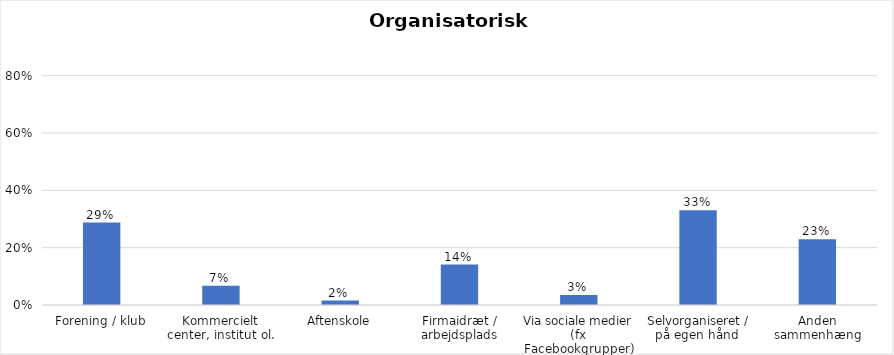
| Category | % |
|---|---|
| Forening / klub | 0.288 |
| Kommercielt center, institut ol. | 0.068 |
| Aftenskole | 0.015 |
| Firmaidræt / arbejdsplads | 0.141 |
| Via sociale medier (fx Facebookgrupper) | 0.035 |
| Selvorganiseret / på egen hånd  | 0.33 |
| Anden sammenhæng | 0.23 |